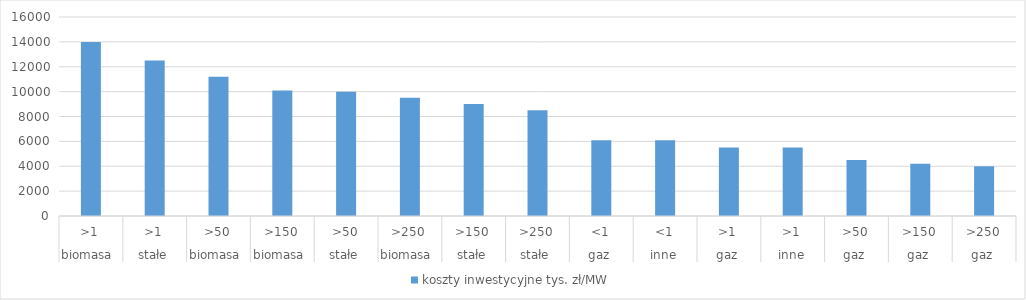
| Category | koszty inwestycyjne |
|---|---|
| 0 | 14000 |
| 1 | 12500 |
| 2 | 11200 |
| 3 | 10100 |
| 4 | 10000 |
| 5 | 9500 |
| 6 | 9000 |
| 7 | 8500 |
| 8 | 6100 |
| 9 | 6100 |
| 10 | 5500 |
| 11 | 5500 |
| 12 | 4500 |
| 13 | 4200 |
| 14 | 4000 |